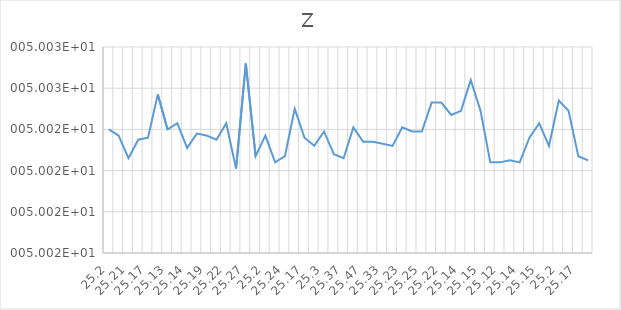
| Category | Z |
|---|---|
| 25.2 | 50.024 |
| 25.26 | 50.024 |
| 25.21 | 50.023 |
| 25.12 | 50.024 |
| 25.17 | 50.024 |
| 25.2 | 50.026 |
| 25.13 | 50.024 |
| 25.1 | 50.024 |
| 25.14 | 50.023 |
| 25.18 | 50.024 |
| 25.19 | 50.024 |
| 25.11 | 50.024 |
| 25.22 | 50.024 |
| 25.16 | 50.022 |
| 25.27 | 50.027 |
| 25.26 | 50.023 |
| 25.2 | 50.024 |
| 25.34 | 50.022 |
| 25.24 | 50.023 |
| 25.2 | 50.025 |
| 25.17 | 50.024 |
| 25.28 | 50.023 |
| 25.3 | 50.024 |
| 25.39 | 50.023 |
| 25.37 | 50.023 |
| 25.32 | 50.024 |
| 25.47 | 50.023 |
| 25.37 | 50.023 |
| 25.33 | 50.023 |
| 25.27 | 50.023 |
| 25.23 | 50.024 |
| 25.31 | 50.024 |
| 25.25 | 50.024 |
| 25.35 | 50.025 |
| 25.22 | 50.025 |
| 25.26 | 50.025 |
| 25.14 | 50.025 |
| 25.07 | 50.026 |
| 25.15 | 50.025 |
| 25.07 | 50.022 |
| 25.12 | 50.022 |
| 25.15 | 50.022 |
| 25.14 | 50.022 |
| 25.13 | 50.024 |
| 25.15 | 50.024 |
| 25.25 | 50.023 |
| 25.2 | 50.025 |
| 25.24 | 50.025 |
| 25.17 | 50.023 |
| 25.08 | 50.022 |